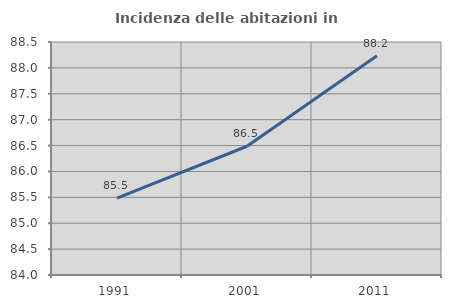
| Category | Incidenza delle abitazioni in proprietà  |
|---|---|
| 1991.0 | 85.484 |
| 2001.0 | 86.486 |
| 2011.0 | 88.235 |